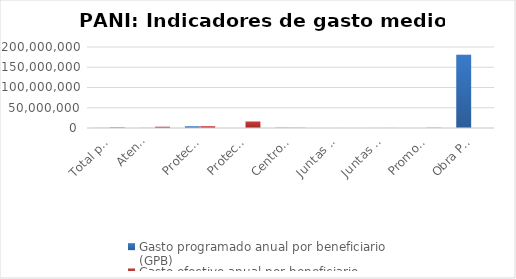
| Category | Gasto programado anual por beneficiario (GPB)  | Gasto efectivo anual por beneficiario (GEB)  |
|---|---|---|
| Total programa | 346564.649 | 1453377.348 |
| Atención de 
denuncias | 287551.28 | 3147172.42 |
| Proteccion y apoyo a los niños, niñas y Adolescenres en los Albergues PANI | 4327821.439 | 4426600.311 |
| Protección y apoyo a los niños, niñas y adolescentes con condición de discapacidad en 2 ONG | 0 | 16111056.747 |
| Centro de Atención Infantil - Guarderias | 795595.221 | 524536.383 |
| Juntas  de Protección de niñez y adolescencia - Promoción  | 69937.27 | 78394.188 |
| Juntas  de Protección de niñez y adolescencia - Prevención | 100639.817 | 142090.633 |
| Promoción y Formación en derechos de los niños, niñas  y adolescentes a través de proyectos impulsados por las ONG. | 0 | 571399.643 |
| Obra Pública | 181007355.286 | 0 |